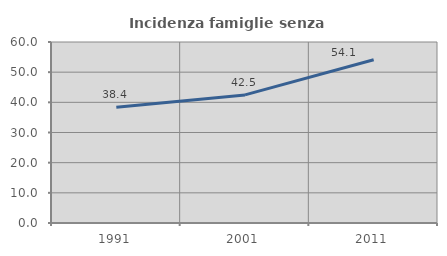
| Category | Incidenza famiglie senza nuclei |
|---|---|
| 1991.0 | 38.365 |
| 2001.0 | 42.466 |
| 2011.0 | 54.11 |